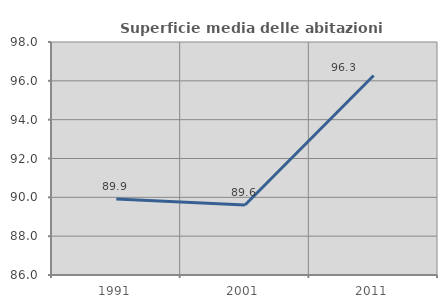
| Category | Superficie media delle abitazioni occupate |
|---|---|
| 1991.0 | 89.914 |
| 2001.0 | 89.604 |
| 2011.0 | 96.273 |